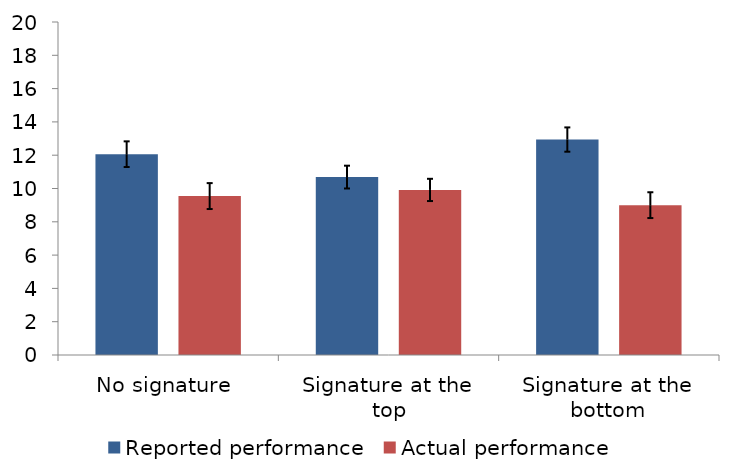
| Category | Reported performance | Actual performance |
|---|---|---|
| No signature | 12.061 | 9.545 |
| Signature at the top | 10.686 | 9.914 |
| Signature at the bottom | 12.939 | 9 |